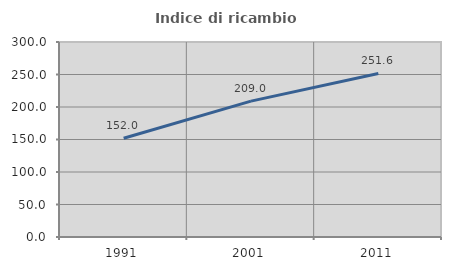
| Category | Indice di ricambio occupazionale  |
|---|---|
| 1991.0 | 151.969 |
| 2001.0 | 209.034 |
| 2011.0 | 251.62 |